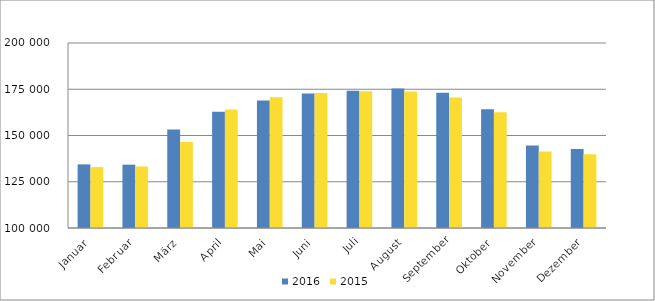
| Category | 2016 | 2015 |
|---|---|---|
| Januar | 134392 | 132910 |
| Februar | 134236 | 133253 |
| März | 153180 | 146441 |
| April | 162837 | 164092 |
| Mai | 168879 | 170673 |
| Juni | 172637 | 172986 |
| Juli | 174178 | 173986 |
| August | 175434 | 173845 |
| September | 173135 | 170494 |
| Oktober | 164181 | 162573 |
| November | 144592 | 141310 |
| Dezember | 142758 | 139798 |